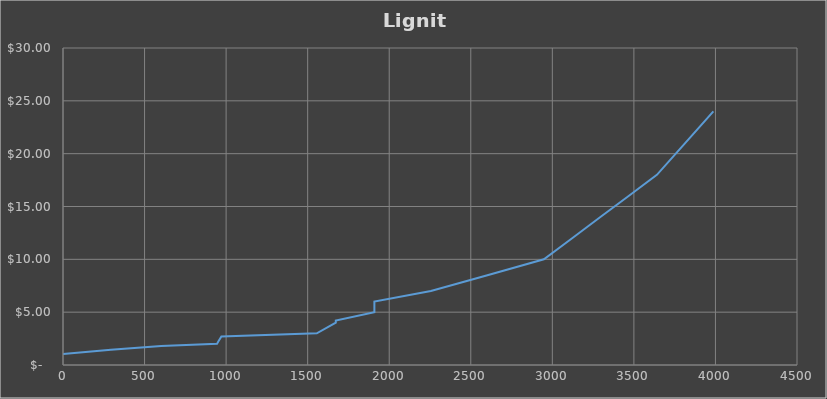
| Category | Series 0 |
|---|---|
| 0.0 | 1.05 |
| 293.69 | 1.45 |
| 602.0 | 1.8 |
| 944.12 | 2 |
| 953.03 | 2.25 |
| 971.12 | 2.7 |
| 1556.0 | 3 |
| 1672.49 | 4 |
| 1672.49 | 4.2 |
| 1909.0 | 5 |
| 1909.0 | 6 |
| 1909.0 | 6 |
| 2255.401 | 7 |
| 2601.8019999999997 | 8.5 |
| 2948.2029999999995 | 10 |
| 3121.4034999999994 | 12 |
| 3294.6039999999994 | 14 |
| 3467.8044999999993 | 16 |
| 3641.004999999999 | 18 |
| 3814.205499999999 | 21 |
| 3987.405999999999 | 24 |